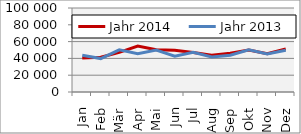
| Category | Jahr 2014 | Jahr 2013 |
|---|---|---|
| Jan | 40387.662 | 43753.58 |
| Feb | 41406.667 | 39783.837 |
| Mär | 47176.685 | 50118.293 |
| Apr | 54588.35 | 45588.02 |
| Mai | 50372.574 | 50046.91 |
| Jun | 49759.2 | 42723.106 |
| Jul | 46968.295 | 47239.621 |
| Aug | 43687.098 | 41777.171 |
| Sep | 46274.986 | 43784.713 |
| Okt | 50058.137 | 50317.028 |
| Nov | 45601.248 | 45367.111 |
| Dez | 51310.398 | 49701.582 |